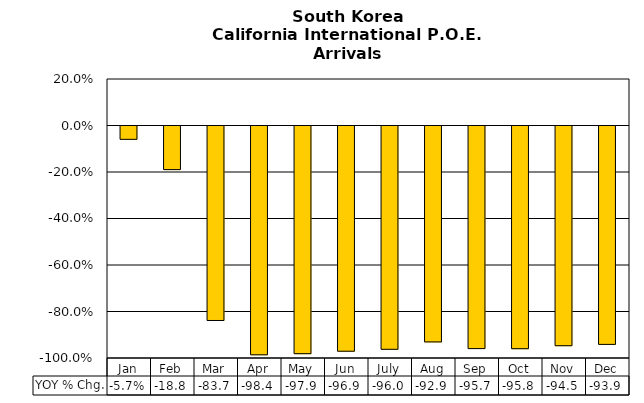
| Category | YOY % Chg. |
|---|---|
| Jan | -0.057 |
| Feb | -0.188 |
| Mar | -0.837 |
| Apr | -0.984 |
| May | -0.979 |
| Jun | -0.969 |
| July | -0.96 |
| Aug | -0.929 |
| Sep | -0.957 |
| Oct | -0.958 |
| Nov | -0.945 |
| Dec | -0.939 |